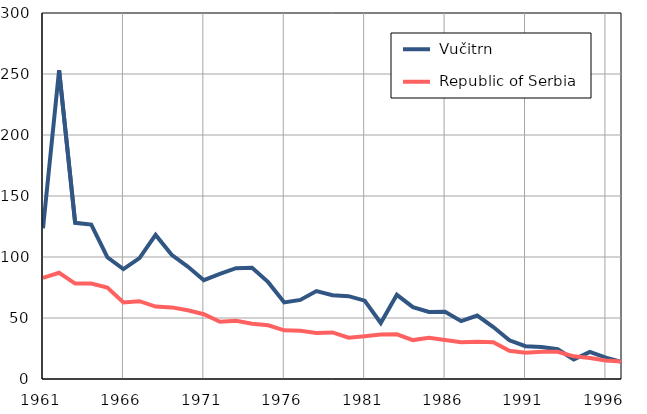
| Category |  Vučitrn |  Republic of Serbia |
|---|---|---|
| 1961.0 | 123.5 | 82.9 |
| 1962.0 | 253.2 | 87.1 |
| 1963.0 | 128 | 78.2 |
| 1964.0 | 126.6 | 78.2 |
| 1965.0 | 99.8 | 74.9 |
| 1966.0 | 90.1 | 62.8 |
| 1967.0 | 99.1 | 63.8 |
| 1968.0 | 118.1 | 59.4 |
| 1969.0 | 101.8 | 58.7 |
| 1970.0 | 92.2 | 56.3 |
| 1971.0 | 81 | 53.1 |
| 1972.0 | 86.1 | 46.9 |
| 1973.0 | 90.8 | 47.7 |
| 1974.0 | 91.2 | 45.3 |
| 1975.0 | 79.4 | 44 |
| 1976.0 | 62.8 | 39.9 |
| 1977.0 | 64.8 | 39.6 |
| 1978.0 | 72.1 | 37.8 |
| 1979.0 | 68.7 | 38.2 |
| 1980.0 | 67.9 | 33.9 |
| 1981.0 | 64.2 | 35 |
| 1982.0 | 45.9 | 36.5 |
| 1983.0 | 69 | 36.6 |
| 1984.0 | 58.9 | 31.9 |
| 1985.0 | 54.9 | 33.7 |
| 1986.0 | 55.2 | 32 |
| 1987.0 | 47.4 | 30.2 |
| 1988.0 | 52 | 30.5 |
| 1989.0 | 42.6 | 30.2 |
| 1990.0 | 31.7 | 23.2 |
| 1991.0 | 26.9 | 21.6 |
| 1992.0 | 26.2 | 22.3 |
| 1993.0 | 24.4 | 22.3 |
| 1994.0 | 16 | 18.6 |
| 1995.0 | 22.2 | 17.2 |
| 1996.0 | 17.5 | 15.1 |
| 1997.0 | 13.9 | 14.2 |